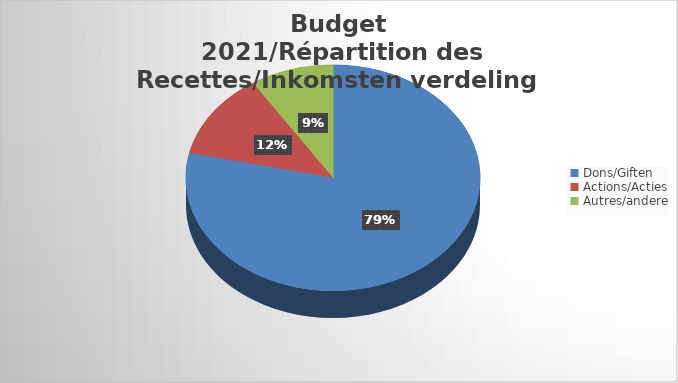
| Category | Series 0 |
|---|---|
| Dons/Giften | 3507935 |
| Actions/Acties | 551500 |
| Autres/andere | 408500 |